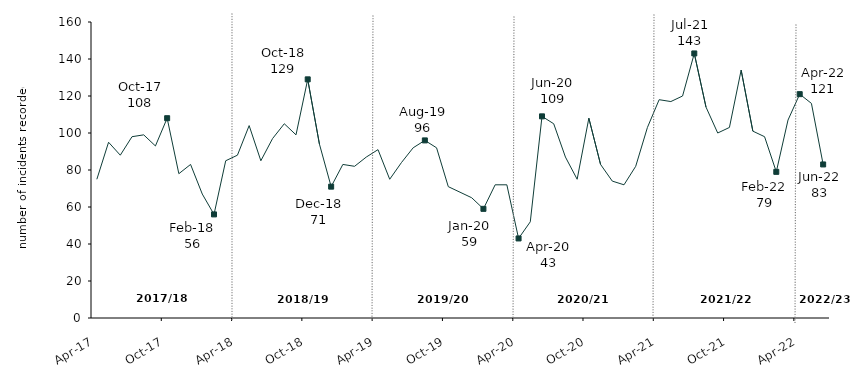
| Category | Series 0 |
|---|---|
| 2017-04-01 | 75 |
| 2017-05-01 | 95 |
| 2017-06-01 | 88 |
| 2017-07-01 | 98 |
| 2017-08-01 | 99 |
| 2017-09-01 | 93 |
| 2017-10-01 | 108 |
| 2017-11-01 | 78 |
| 2017-12-01 | 83 |
| 2018-01-01 | 67 |
| 2018-02-01 | 56 |
| 2018-03-01 | 85 |
| 2018-04-01 | 88 |
| 2018-05-01 | 104 |
| 2018-06-01 | 85 |
| 2018-07-01 | 97 |
| 2018-08-01 | 105 |
| 2018-09-01 | 99 |
| 2018-10-01 | 129 |
| 2018-11-01 | 94 |
| 2018-12-01 | 71 |
| 2019-01-01 | 83 |
| 2019-02-01 | 82 |
| 2019-03-01 | 87 |
| 2019-04-01 | 91 |
| 2019-05-01 | 75 |
| 2019-06-01 | 84 |
| 2019-07-01 | 92 |
| 2019-08-01 | 96 |
| 2019-09-01 | 92 |
| 2019-10-01 | 71 |
| 2019-11-01 | 68 |
| 2019-12-01 | 65 |
| 2020-01-01 | 59 |
| 2020-02-01 | 72 |
| 2020-03-01 | 72 |
| 2020-04-01 | 43 |
| 2020-05-01 | 52 |
| 2020-06-01 | 109 |
| 2020-07-01 | 105 |
| 2020-08-01 | 87 |
| 2020-09-01 | 75 |
| 2020-10-01 | 108 |
| 2020-11-01 | 83 |
| 2020-12-01 | 74 |
| 2021-01-01 | 72 |
| 2021-02-01 | 82 |
| 2021-03-01 | 103 |
| 2021-04-01 | 118 |
| 2021-05-01 | 117 |
| 2021-06-01 | 120 |
| 2021-07-01 | 143 |
| 2021-08-01 | 114 |
| 2021-09-01 | 100 |
| 2021-10-01 | 103 |
| 2021-11-01 | 134 |
| 2021-12-01 | 101 |
| 2022-01-01 | 98 |
| 2022-02-01 | 79 |
| 2022-03-01 | 107 |
| 2022-04-01 | 121 |
| 2022-05-01 | 116 |
| 2022-06-01 | 83 |